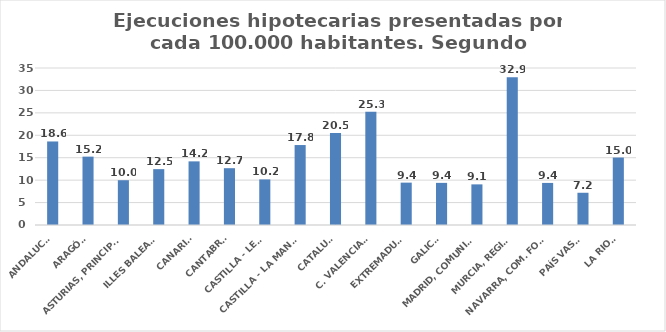
| Category | Series 0 |
|---|---|
| ANDALUCÍA | 18.622 |
| ARAGÓN | 15.241 |
| ASTURIAS, PRINCIPADO | 9.985 |
| ILLES BALEARS | 12.454 |
| CANARIAS | 14.185 |
| CANTABRIA | 12.665 |
| CASTILLA - LEÓN | 10.163 |
| CASTILLA - LA MANCHA | 17.824 |
| CATALUÑA | 20.524 |
| C. VALENCIANA | 25.25 |
| EXTREMADURA | 9.445 |
| GALICIA | 9.39 |
| MADRID, COMUNIDAD | 9.058 |
| MURCIA, REGIÓN | 32.939 |
| NAVARRA, COM. FORAL | 9.379 |
| PAÍS VASCO | 7.186 |
| LA RIOJA | 15.036 |